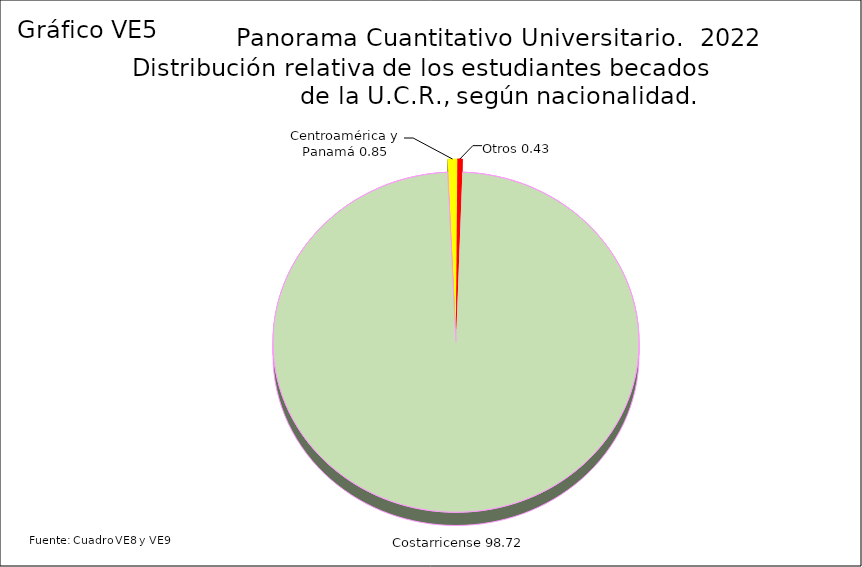
| Category | Series 3 |
|---|---|
| Costarricense | 98.72 |
| Centroamérica y Panamá | 0.85 |
| Otros | 0.43 |